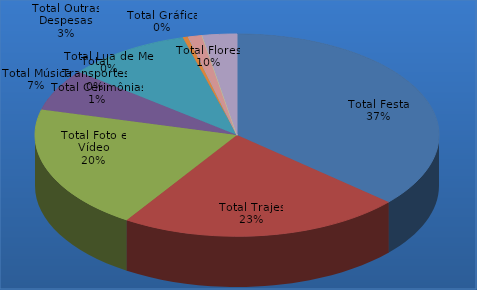
| Category | Series 0 |
|---|---|
| Total Festa | 0.365 |
| Total Trajes | 0.227 |
| Total Foto e Vídeo | 0.199 |
| Total Música | 0.066 |
| Total Flores | 0.1 |
| Total Gráfica | 0.004 |
| Total Transportes | 0 |
| Total Cerimônias | 0.011 |
| Total Lua de Mel | 0 |
| Total Outras Despesas | 0.028 |